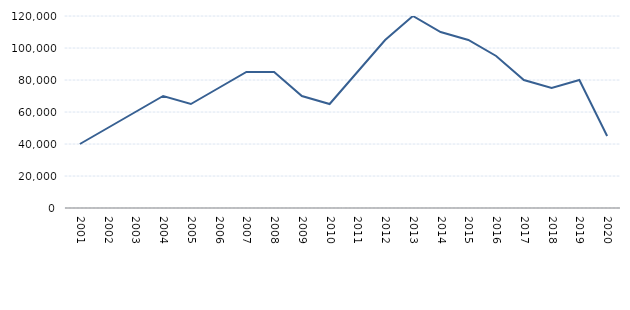
| Category | Series 1 |
|---|---|
| 2001.0 | 40000 |
| 2002.0 | 50000 |
| 2003.0 | 60000 |
| 2004.0 | 70000 |
| 2005.0 | 65000 |
| 2006.0 | 75000 |
| 2007.0 | 85000 |
| 2008.0 | 85000 |
| 2009.0 | 70000 |
| 2010.0 | 65000 |
| 2011.0 | 85000 |
| 2012.0 | 105000 |
| 2013.0 | 120000 |
| 2014.0 | 110000 |
| 2015.0 | 105000 |
| 2016.0 | 95000 |
| 2017.0 | 80000 |
| 2018.0 | 75000 |
| 2019.0 | 80000 |
| 2020.0 | 45000 |